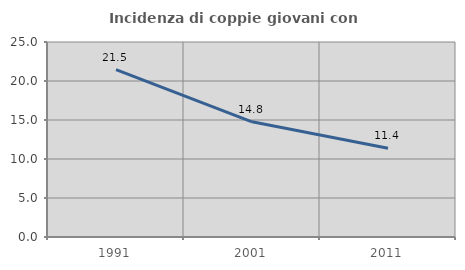
| Category | Incidenza di coppie giovani con figli |
|---|---|
| 1991.0 | 21.459 |
| 2001.0 | 14.766 |
| 2011.0 | 11.367 |